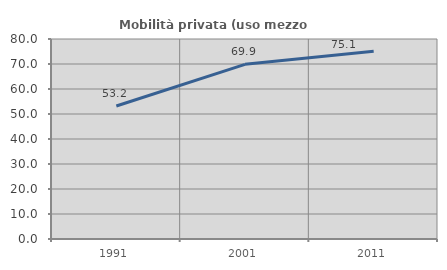
| Category | Mobilità privata (uso mezzo privato) |
|---|---|
| 1991.0 | 53.191 |
| 2001.0 | 69.876 |
| 2011.0 | 75.123 |